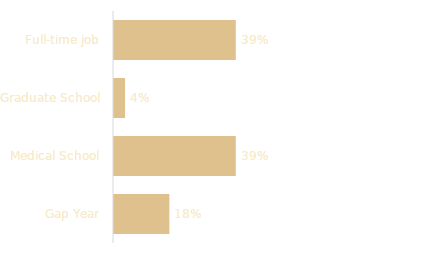
| Category | Total |
|---|---|
| Full-time job | 0.393 |
| Graduate School | 0.036 |
| Medical School | 0.393 |
| Gap Year | 0.179 |